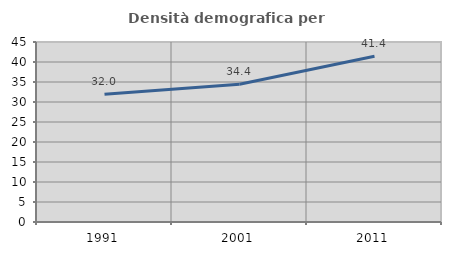
| Category | Densità demografica |
|---|---|
| 1991.0 | 31.961 |
| 2001.0 | 34.441 |
| 2011.0 | 41.419 |